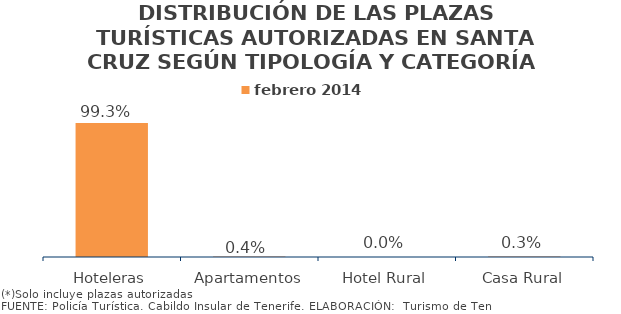
| Category | febrero 2014 |
|---|---|
| Hoteleras | 0.993 |
| Apartamentos | 0.004 |
| Hotel Rural | 0 |
| Casa Rural | 0.003 |